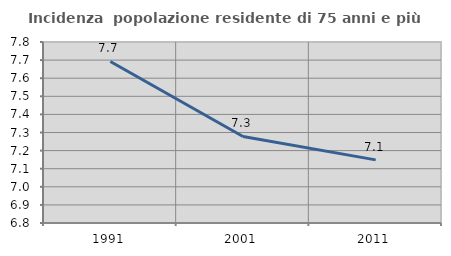
| Category | Incidenza  popolazione residente di 75 anni e più |
|---|---|
| 1991.0 | 7.692 |
| 2001.0 | 7.278 |
| 2011.0 | 7.149 |